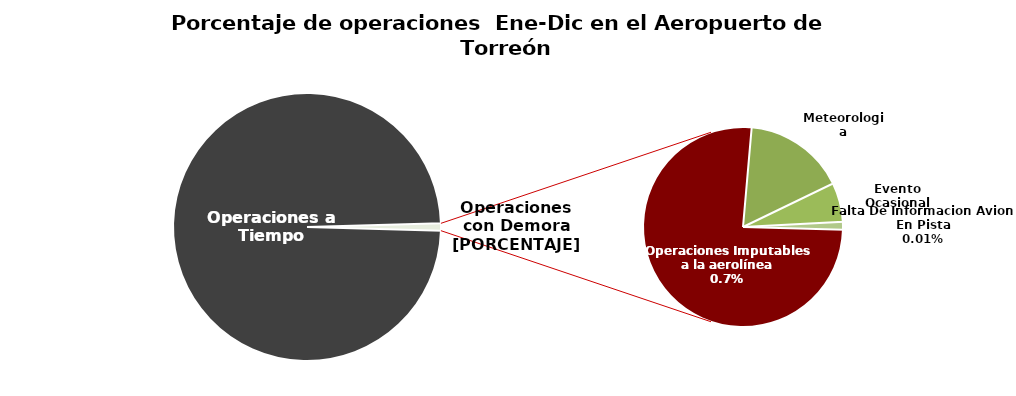
| Category | Series 0 |
|---|---|
| Operaciones a Tiempo | 8977 |
| Operaciones Imputables a la aerolínea | 60 |
| Meteorologia | 13 |
| Evento Ocasional | 5 |
| Falta De Informacion Avion En Pista | 1 |